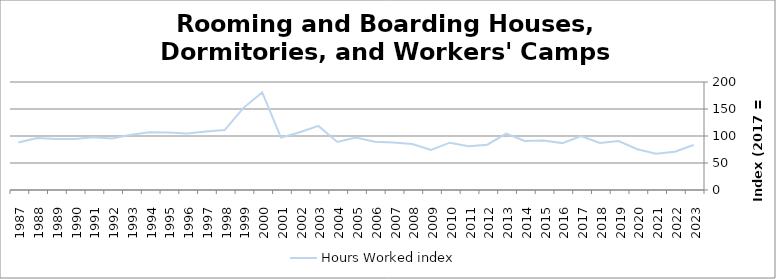
| Category | Hours Worked index |
|---|---|
| 2023.0 | 83.354 |
| 2022.0 | 70.945 |
| 2021.0 | 67.256 |
| 2020.0 | 75.404 |
| 2019.0 | 90.577 |
| 2018.0 | 87.075 |
| 2017.0 | 100 |
| 2016.0 | 86.845 |
| 2015.0 | 91.461 |
| 2014.0 | 90.862 |
| 2013.0 | 104.376 |
| 2012.0 | 83.979 |
| 2011.0 | 80.937 |
| 2010.0 | 87.636 |
| 2009.0 | 74.063 |
| 2008.0 | 85.081 |
| 2007.0 | 88.181 |
| 2006.0 | 89.193 |
| 2005.0 | 97.28 |
| 2004.0 | 89.063 |
| 2003.0 | 118.716 |
| 2002.0 | 106.828 |
| 2001.0 | 96.98 |
| 2000.0 | 180.667 |
| 1999.0 | 152.134 |
| 1998.0 | 110.891 |
| 1997.0 | 108.358 |
| 1996.0 | 104.604 |
| 1995.0 | 106.643 |
| 1994.0 | 107.066 |
| 1993.0 | 102.22 |
| 1992.0 | 95.593 |
| 1991.0 | 97.817 |
| 1990.0 | 94.335 |
| 1989.0 | 94.503 |
| 1988.0 | 96.311 |
| 1987.0 | 88.034 |